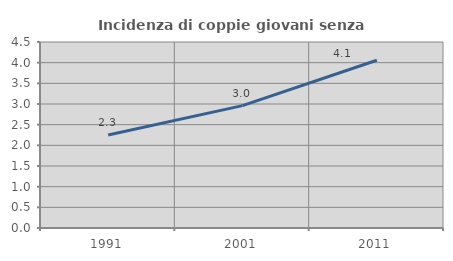
| Category | Incidenza di coppie giovani senza figli |
|---|---|
| 1991.0 | 2.251 |
| 2001.0 | 2.961 |
| 2011.0 | 4.059 |